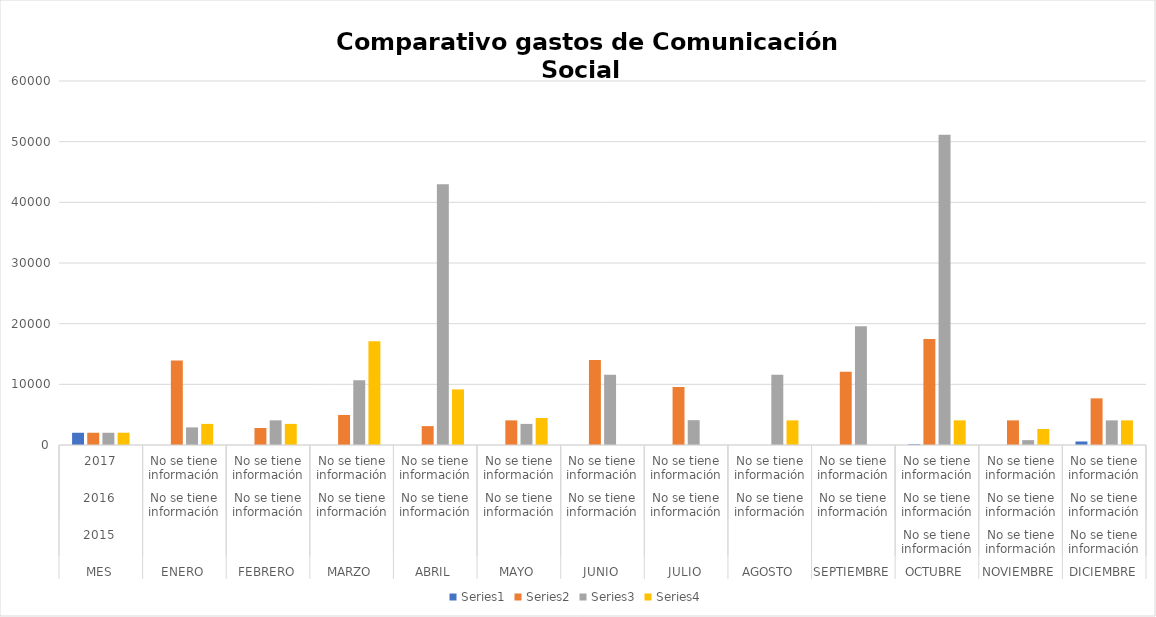
| Category | Series 0 | Series 1 | Series 2 | Series 3 |
|---|---|---|---|---|
| 0 | 2018 | 2019 | 2020 | 2021 |
| 1 | 0 | 13916.52 | 2900 | 3480 |
| 2 | 0 | 2807.2 | 4065.8 | 3480 |
| 3 | 0 | 4953.2 | 10672 | 17121.6 |
| 4 | 0 | 3114.6 | 42983.59 | 9164 |
| 5 | 0 | 4060 | 3480 | 4454 |
| 6 | 0 | 14016 | 11600 | 0 |
| 7 | 0 | 9559.32 | 4094 | 0 |
| 8 | 0 | 0 | 11600 | 4060 |
| 9 | 0 | 12064 | 19555.28 | 0 |
| 10 | 116 | 17467.78 | 51132.8 | 4060 |
| 11 | 0 | 4060 | 800.4 | 2634.86 |
| 12 | 580 | 7690.8 | 4060 | 4060 |